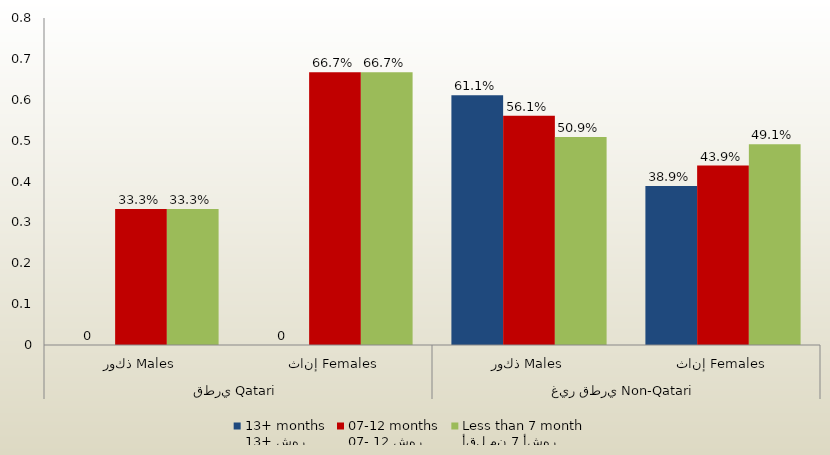
| Category | 13+ شهر
13+ months | 07- 12 شهر
07-12 months | أقل من 7 أشهر
Less than 7 month  |
|---|---|---|---|
| 0 | 0 | 0.333 | 0.333 |
| 1 | 0 | 0.667 | 0.667 |
| 2 | 0.611 | 0.561 | 0.509 |
| 3 | 0.389 | 0.439 | 0.491 |